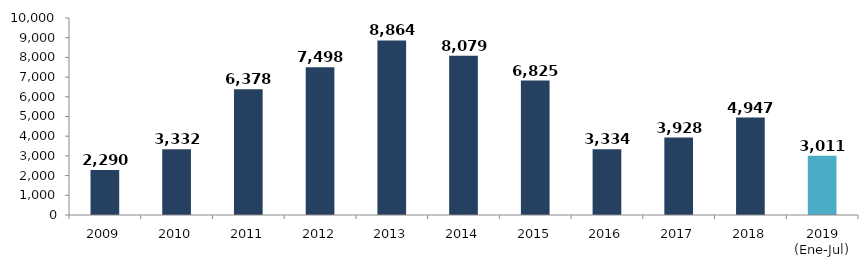
| Category | TOTAL |
|---|---|
| 2009 | 2290.273 |
| 2010 | 3331.554 |
| 2011 | 6377.615 |
| 2012 | 7498.207 |
| 2013 | 8863.622 |
| 2014 | 8079.21 |
| 2015 | 6824.624 |
| 2016 | 3333.564 |
| 2017 | 3928.017 |
| 2018 | 4947.435 |
| 2019 (Ene-Jul) | 3011.025 |